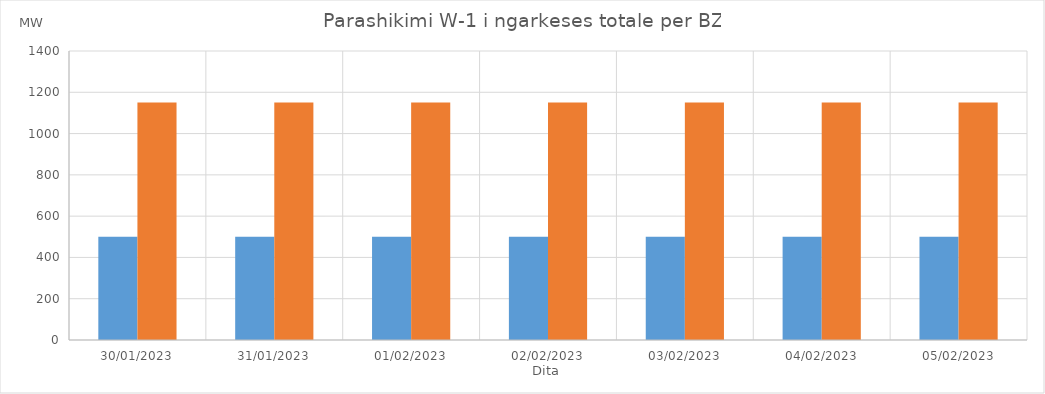
| Category | Min (MW) | Max (MW) |
|---|---|---|
| 30/01/2023 | 500 | 1150 |
| 31/01/2023 | 500 | 1150 |
| 01/02/2023 | 500 | 1150 |
| 02/02/2023 | 500 | 1150 |
| 03/02/2023 | 500 | 1150 |
| 04/02/2023 | 500 | 1150 |
| 05/02/2023 | 500 | 1150 |